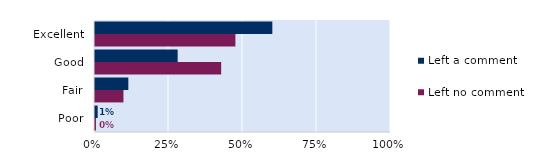
| Category | Left no comment | Left a comment |
|---|---|---|
| Poor | 0.003 | 0.009 |
| Fair | 0.096 | 0.113 |
| Good | 0.426 | 0.279 |
| Excellent | 0.474 | 0.599 |